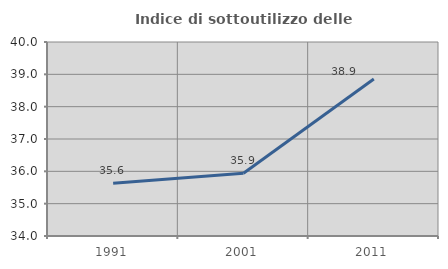
| Category | Indice di sottoutilizzo delle abitazioni  |
|---|---|
| 1991.0 | 35.632 |
| 2001.0 | 35.941 |
| 2011.0 | 38.856 |